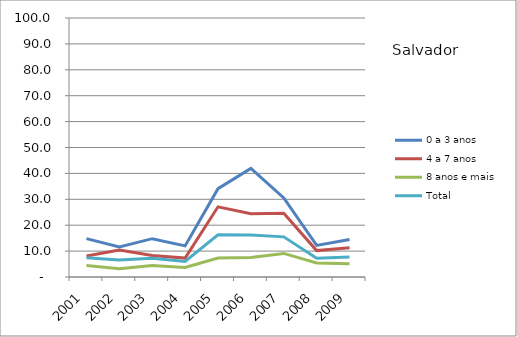
| Category | 0 a 3 anos | 4 a 7 anos | 8 anos e mais | Total |
|---|---|---|---|---|
| 2001.0 | 14.8 | 8.1 | 4.4 | 7.4 |
| 2002.0 | 11.6 | 10.4 | 3.2 | 6.6 |
| 2003.0 | 14.8 | 8.3 | 4.4 | 7.2 |
| 2004.0 | 12 | 7.3 | 3.7 | 6 |
| 2005.0 | 34.1 | 27.1 | 7.3 | 16.3 |
| 2006.0 | 41.9 | 24.4 | 7.5 | 16.2 |
| 2007.0 | 30.5 | 24.6 | 9.1 | 15.5 |
| 2008.0 | 12.2 | 10.2 | 5.4 | 7.2 |
| 2009.0 | 14.5 | 11.3 | 5.1 | 7.7 |